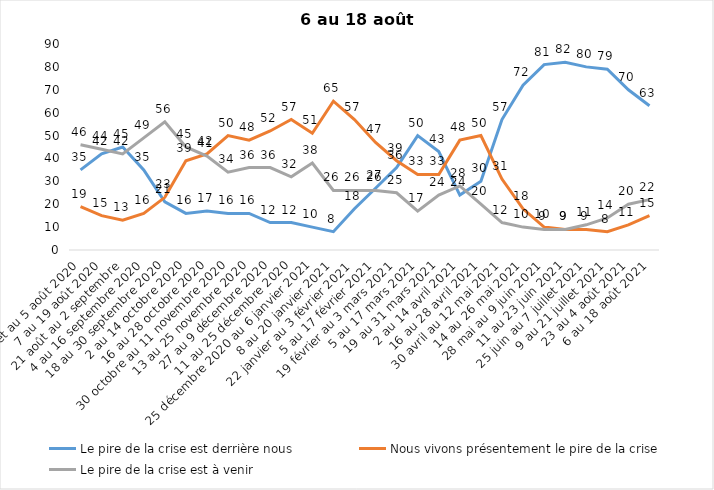
| Category | Le pire de la crise est derrière nous | Nous vivons présentement le pire de la crise | Le pire de la crise est à venir |
|---|---|---|---|
| 24 juillet au 5 août 2020 | 35 | 19 | 46 |
| 7 au 19 août 2020 | 42 | 15 | 44 |
| 21 août au 2 septembre | 45 | 13 | 42 |
| 4 au 16 septembre 2020 | 35 | 16 | 49 |
| 18 au 30 septembre 2020 | 21 | 23 | 56 |
| 2 au 14 octobre 2020 | 16 | 39 | 45 |
| 16 au 28 octobre 2020 | 17 | 42 | 41 |
| 30 octobre au 11 novembre 2020 | 16 | 50 | 34 |
| 13 au 25 novembre 2020 | 16 | 48 | 36 |
| 27 au 9 décembre 2020 | 12 | 52 | 36 |
| 11 au 25 décembre 2020 | 12 | 57 | 32 |
| 25 décembre 2020 au 6 janvier 2021 | 10 | 51 | 38 |
| 8 au 20 janvier 2021 | 8 | 65 | 26 |
| 22 janvier au 3 février 2021 | 18 | 57 | 26 |
| 5 au 17 février 2021 | 27 | 47 | 26 |
| 19 février au 3 mars 2021 | 36 | 39 | 25 |
| 5 au 17 mars 2021 | 50 | 33 | 17 |
| 19 au 31 mars 2021 | 43 | 33 | 24 |
| 2 au 14 avril 2021 | 24 | 48 | 28 |
| 16 au 28 avril 2021 | 30 | 50 | 20 |
| 30 avril au 12 mai 2021 | 57 | 31 | 12 |
| 14 au 26 mai 2021 | 72 | 18 | 10 |
| 28 mai au 9 juin 2021 | 81 | 10 | 9 |
| 11 au 23 juin 2021 | 82 | 9 | 9 |
| 25 juin au 7 juillet 2021 | 80 | 9 | 11 |
| 9 au 21 juillet 2021 | 79 | 8 | 14 |
| 23 au 4 août 2021 | 70 | 11 | 20 |
| 6 au 18 août 2021 | 63 | 15 | 22 |